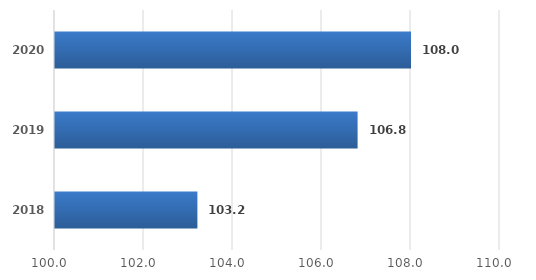
| Category | Series 0 |
|---|---|
| 2018.0 | 103.2 |
| 2019.0 | 106.8 |
| 2020.0 | 108 |